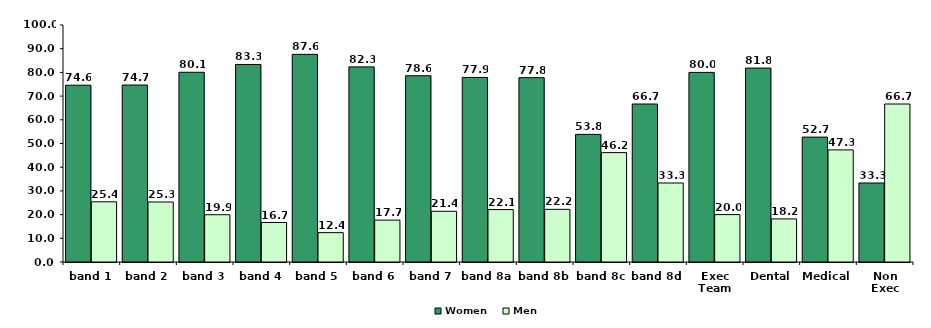
| Category | Women | Men |
|---|---|---|
| band 1 | 74.603 | 25.397 |
| band 2 | 74.679 | 25.321 |
| band 3 | 80.056 | 19.944 |
| band 4 | 83.333 | 16.667 |
| band 5 | 87.617 | 12.383 |
| band 6 | 82.33 | 17.67 |
| band 7 | 78.596 | 21.404 |
| band 8a | 77.876 | 22.124 |
| band 8b | 77.778 | 22.222 |
| band 8c | 53.846 | 46.154 |
| band 8d | 66.667 | 33.333 |
| Exec Team | 80 | 20 |
| Dental | 81.818 | 18.182 |
| Medical | 52.703 | 47.297 |
| Non Exec | 33.333 | 66.667 |